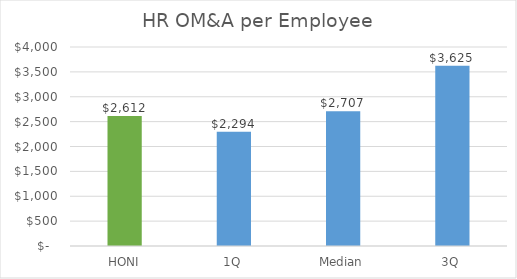
| Category | HR OM&A per Employee |
|---|---|
| HONI | 2612.476 |
| 1Q | 2294.428 |
| Median | 2706.902 |
| 3Q | 3625.229 |